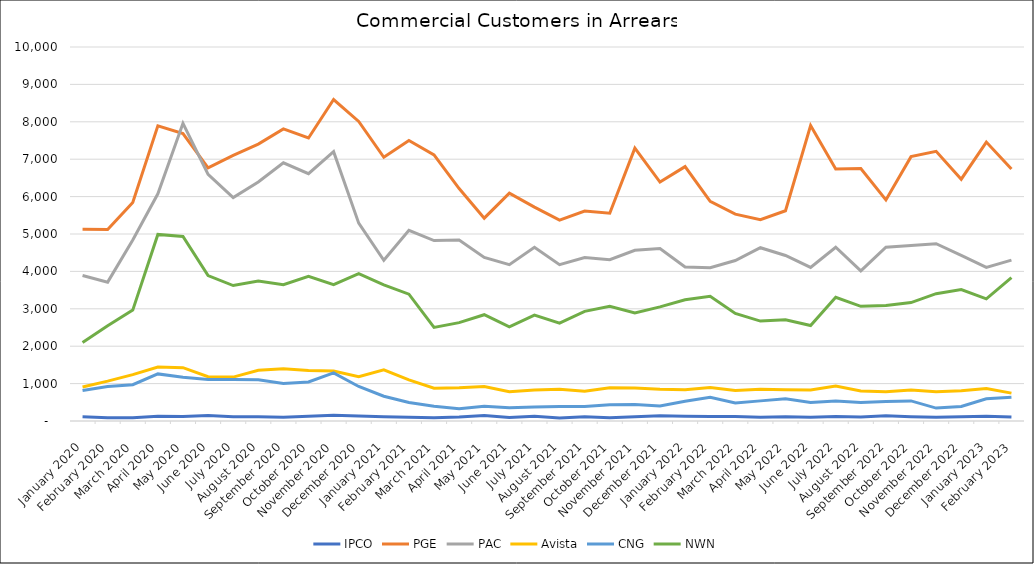
| Category | IPCO | PGE | PAC | Avista | CNG | NWN |
|---|---|---|---|---|---|---|
| 2020-01-01 | 113 | 5130 | 3892 | 911 | 813 | 2099 |
| 2020-02-01 | 87 | 5119 | 3713 | 1066 | 920 | 2548 |
| 2020-03-01 | 86 | 5842 | 4840 | 1239 | 970 | 2965 |
| 2020-04-01 | 127 | 7893 | 6075 | 1445 | 1259 | 4988 |
| 2020-05-01 | 120 | 7687 | 7959 | 1427 | 1171 | 4934 |
| 2020-06-01 | 145 | 6770 | 6594 | 1186 | 1108 | 3889 |
| 2020-07-01 | 113 | 7103 | 5975 | 1174 | 1108 | 3622 |
| 2020-08-01 | 113 | 7404 | 6393 | 1357 | 1102 | 3744 |
| 2020-09-01 | 99 | 7810 | 6903 | 1398 | 1000 | 3645 |
| 2020-10-01 | 129 | 7568 | 6612 | 1351 | 1043 | 3871 |
| 2020-11-01 | 152 | 8596 | 7202 | 1336 | 1288 | 3644 |
| 2020-12-01 | 131 | 8010 | 5289 | 1185 | 923 | 3940 |
| 2021-01-01 | 111 | 7051 | 4298 | 1370 | 662 | 3638 |
| 2021-02-01 | 98 | 7500 | 5099 | 1100 | 495 | 3392 |
| 2021-03-01 | 90 | 7117 | 4825 | 875 | 395 | 2502 |
| 2021-04-01 | 106 | 6215 | 4838 | 886 | 328 | 2631 |
| 2021-05-01 | 148 | 5423 | 4373 | 921 | 396 | 2842 |
| 2021-06-01 | 96 | 6091 | 4181 | 784 | 353 | 2516 |
| 2021-07-01 | 128 | 5717 | 4647 | 826 | 372 | 2830 |
| 2021-08-01 | 77 | 5372 | 4181 | 847 | 388 | 2616 |
| 2021-09-01 | 116 | 5615 | 4370 | 796 | 391 | 2932 |
| 2021-10-01 | 88 | 5555 | 4313 | 888 | 432 | 3068 |
| 2021-11-01 | 112 | 7297 | 4565 | 884 | 440 | 2892 |
| 2021-12-01 | 138 | 6388 | 4612 | 847 | 400 | 3052 |
| 2022-01-01 | 127 | 6802 | 4116 | 836 | 528 | 3243 |
| 2022-02-01 | 117 | 5871 | 4098 | 895 | 633 | 3333 |
| 2022-03-01 | 120 | 5532 | 4292 | 813 | 482 | 2877 |
| 2022-04-01 | 101 | 5381 | 4633 | 848 | 538 | 2671 |
| 2022-05-01 | 111 | 5621 | 4425 | 838 | 594 | 2704 |
| 2022-06-01 | 103 | 7902 | 4105 | 828 | 495 | 2552 |
| 2022-07-01 | 121 | 6740 | 4646 | 937 | 535 | 3309 |
| 2022-08-01 | 109 | 6752 | 4012 | 805 | 496 | 3067 |
| 2022-09-01 | 141 | 5911 | 4646 | 781 | 522 | 3089 |
| 2022-10-01 | 113 | 7068 | 4690 | 827 | 537 | 3166 |
| 2022-11-01 | 97 | 7210 | 4741 | 781 | 345 | 3404 |
| 2022-12-01 | 115 | 6465 | 4431 | 812 | 388 | 3514 |
| 2023-01-01 | 127 | 7458 | 4106 | 866 | 596 | 3266 |
| 2023-02-01 | 105 | 6736 | 4300 | 745 | 638 | 3833 |